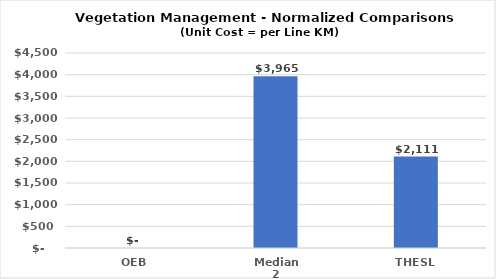
| Category | Series 0 |
|---|---|
| OEB | 0 |
| Median 2 | 3965.323 |
| THESL | 2111 |